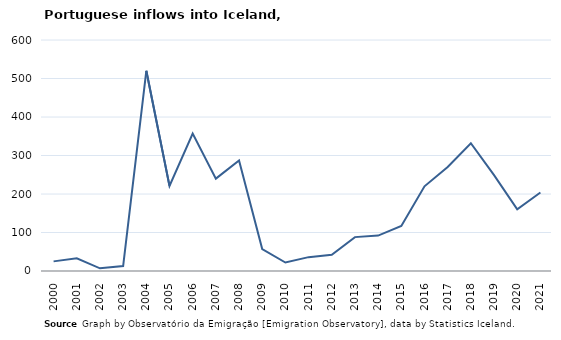
| Category | Entradas |
|---|---|
| 2000.0 | 25 |
| 2001.0 | 33 |
| 2002.0 | 7 |
| 2003.0 | 13 |
| 2004.0 | 520 |
| 2005.0 | 221 |
| 2006.0 | 357 |
| 2007.0 | 240 |
| 2008.0 | 287 |
| 2009.0 | 57 |
| 2010.0 | 22 |
| 2011.0 | 36 |
| 2012.0 | 42 |
| 2013.0 | 88 |
| 2014.0 | 92 |
| 2015.0 | 117 |
| 2016.0 | 220 |
| 2017.0 | 270 |
| 2018.0 | 332 |
| 2019.0 | 249 |
| 2020.0 | 160 |
| 2021.0 | 204 |